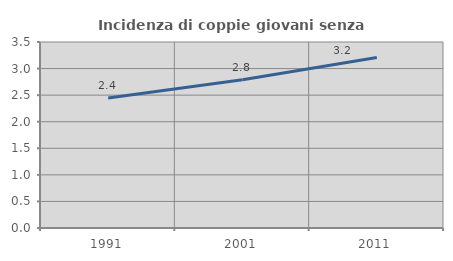
| Category | Incidenza di coppie giovani senza figli |
|---|---|
| 1991.0 | 2.446 |
| 2001.0 | 2.788 |
| 2011.0 | 3.208 |